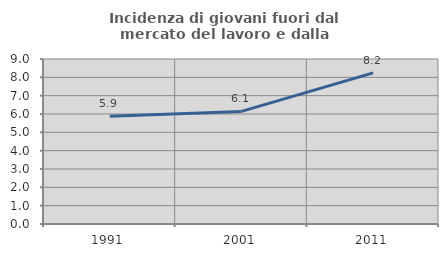
| Category | Incidenza di giovani fuori dal mercato del lavoro e dalla formazione  |
|---|---|
| 1991.0 | 5.88 |
| 2001.0 | 6.141 |
| 2011.0 | 8.246 |